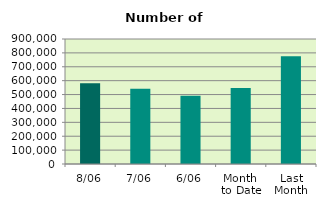
| Category | Series 0 |
|---|---|
| 8/06 | 580938 |
| 7/06 | 541914 |
| 6/06 | 490692 |
| Month 
to Date | 547642 |
| Last
Month | 776305.545 |